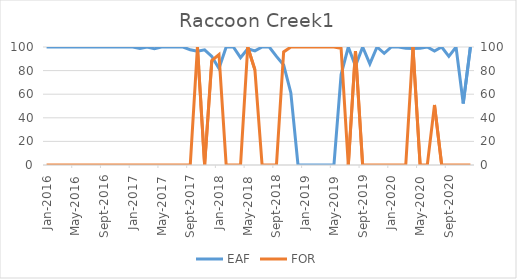
| Category | EAF |
|---|---|
| 2016-01-01 | 100 |
| 2016-02-01 | 100 |
| 2016-03-01 | 100 |
| 2016-04-01 | 100 |
| 2016-05-01 | 100 |
| 2016-06-01 | 100 |
| 2016-07-01 | 100 |
| 2016-08-01 | 100 |
| 2016-09-01 | 100 |
| 2016-10-01 | 100 |
| 2016-11-01 | 100 |
| 2016-12-01 | 100 |
| 2017-01-01 | 100 |
| 2017-02-01 | 98.81 |
| 2017-03-01 | 100 |
| 2017-04-01 | 98.47 |
| 2017-05-01 | 100 |
| 2017-06-01 | 100 |
| 2017-07-01 | 100 |
| 2017-08-01 | 100 |
| 2017-09-01 | 97.64 |
| 2017-10-01 | 96.42 |
| 2017-11-01 | 97.64 |
| 2017-12-01 | 92 |
| 2018-01-01 | 81.78 |
| 2018-02-01 | 100 |
| 2018-03-01 | 100 |
| 2018-04-01 | 90.97 |
| 2018-05-01 | 98.52 |
| 2018-06-01 | 96.67 |
| 2018-07-01 | 100 |
| 2018-08-01 | 100 |
| 2018-09-01 | 92.02 |
| 2018-10-01 | 84.81 |
| 2018-11-01 | 61.3 |
| 2018-12-01 | 0 |
| 2019-01-01 | 0 |
| 2019-02-01 | 0 |
| 2019-03-01 | 0 |
| 2019-04-01 | 0 |
| 2019-05-01 | 0 |
| 2019-06-01 | 76.67 |
| 2019-07-01 | 100 |
| 2019-08-01 | 83.92 |
| 2019-09-01 | 100 |
| 2019-10-01 | 85.75 |
| 2019-11-01 | 100 |
| 2019-12-01 | 94.63 |
| 2020-01-01 | 100 |
| 2020-02-01 | 100 |
| 2020-03-01 | 98.95 |
| 2020-04-01 | 98.75 |
| 2020-05-01 | 98.88 |
| 2020-06-01 | 100 |
| 2020-07-01 | 96.58 |
| 2020-08-01 | 100 |
| 2020-09-01 | 92.09 |
| 2020-10-01 | 100 |
| 2020-11-01 | 52.12 |
| 2020-12-01 | 100 |